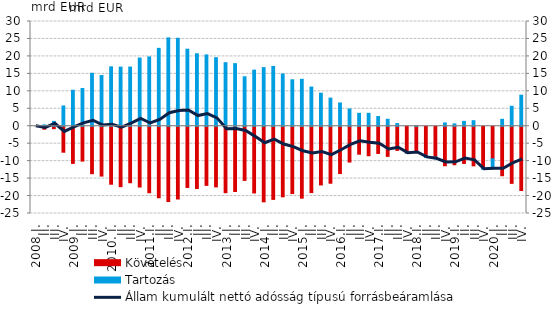
| Category | Követelés | Tartozás |
|---|---|---|
| 2008.I. | 0 | 0 |
| II. | -0.851 | 0.372 |
| III. | -0.698 | 1.388 |
| IV. | -7.444 | 5.798 |
| 2009.I. | -10.651 | 10.301 |
| II. | -9.986 | 10.798 |
| III. | -13.594 | 15.17 |
| IV. | -14.283 | 14.52 |
| 2010. I. | -16.613 | 17.005 |
| II. | -17.314 | 16.929 |
| III. | -16.185 | 16.948 |
| IV. | -17.416 | 19.527 |
| 2011.I. | -19.061 | 19.849 |
| II. | -20.485 | 22.309 |
| III. | -21.575 | 25.301 |
| IV. | -20.841 | 25.195 |
| 2012.I. | -17.539 | 22.066 |
| II. | -17.847 | 20.761 |
| III. | -16.951 | 20.433 |
| IV. | -17.379 | 19.629 |
| 2013.I. | -19.043 | 18.207 |
| II. | -18.703 | 17.929 |
| III. | -15.515 | 14.165 |
| IV. | -19.124 | 16.074 |
| 2014.I. | -21.656 | 16.791 |
| II. | -20.959 | 17.124 |
| III. | -20.221 | 14.972 |
| IV. | -19.295 | 13.303 |
| 2015.I. | -20.605 | 13.44 |
| II. | -19.008 | 11.22 |
| III. | -16.826 | 9.454 |
| IV. | -16.33 | 8.051 |
| 2016.I. | -13.559 | 6.668 |
| II. | -10.267 | 4.929 |
| III. | -8.014 | 3.69 |
| IV. | -8.453 | 3.701 |
| 2017.I. | -7.794 | 2.764 |
| II. | -8.643 | 1.985 |
| III. | -6.917 | 0.76 |
| IV. | -7.651 | -0.06 |
| 2018.I. | -7.553 | 0.022 |
| II. | -8.353 | -0.577 |
| III. | -8.827 | -0.501 |
| IV. | -11.319 | 0.947 |
| 2019.I. | -11.034 | 0.681 |
| II. | -10.662 | 1.404 |
| III. | -11.346 | 1.585 |
| IV. | -11.85 | -0.492 |
| 2020.I. | -9.324 | -2.889 |
| II. | -14.184 | 1.979 |
| III. | -16.363 | 5.717 |
| IV. | -18.407 | 8.887 |